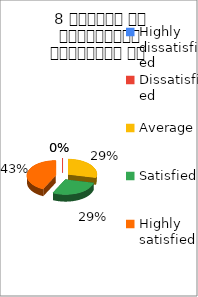
| Category | 8 शिक्षक का सम्प्रेषण सुस्पष्ठ है  |
|---|---|
| Highly dissatisfied | 0 |
| Dissatisfied | 0 |
| Average | 2 |
| Satisfied | 2 |
| Highly satisfied | 3 |